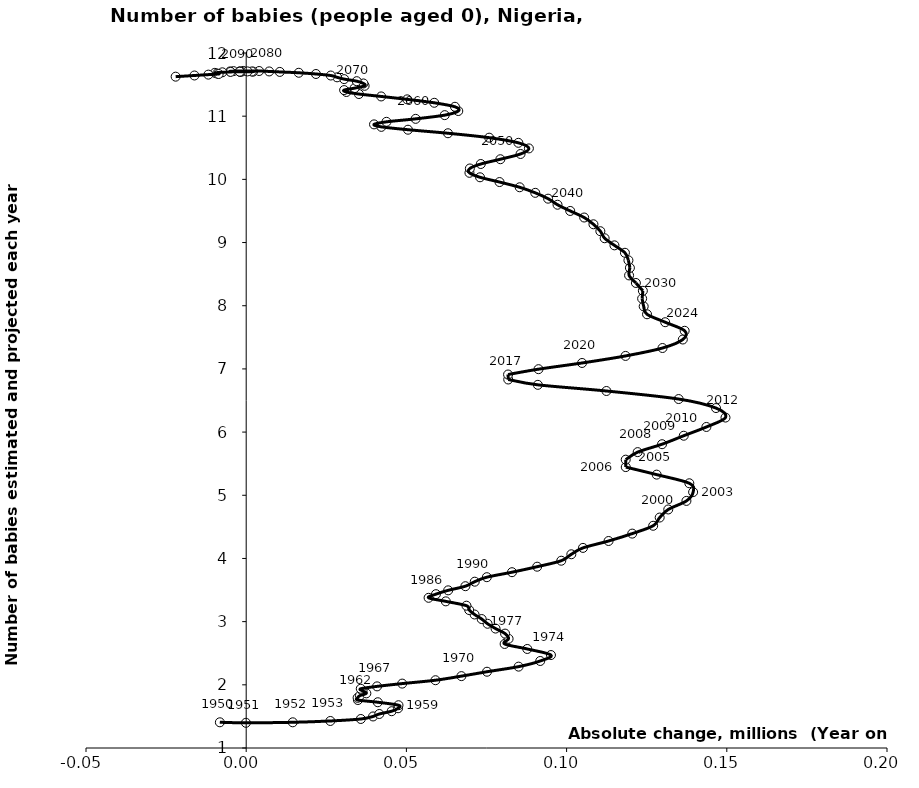
| Category | Series 0 |
|---|---|
| -0.008219999999999894 | 1.407 |
| -8.649999999998936e-05 | 1.399 |
| 0.014528499999999944 | 1.407 |
| 0.026262000000000008 | 1.428 |
| 0.03577600000000003 | 1.459 |
| 0.03959500000000005 | 1.499 |
| 0.04154150000000001 | 1.538 |
| 0.04540349999999993 | 1.582 |
| 0.04740599999999995 | 1.629 |
| 0.04753050000000003 | 1.677 |
| 0.041073000000000026 | 1.724 |
| 0.03486250000000002 | 1.759 |
| 0.03476950000000001 | 1.794 |
| 0.03549899999999995 | 1.829 |
| 0.03749899999999995 | 1.865 |
| 0.036323000000000105 | 1.904 |
| 0.03575700000000004 | 1.938 |
| 0.04084449999999995 | 1.975 |
| 0.04869000000000001 | 2.019 |
| 0.05907499999999999 | 2.073 |
| 0.06717050000000002 | 2.138 |
| 0.07515899999999998 | 2.207 |
| 0.08501650000000005 | 2.288 |
| 0.09177349999999995 | 2.377 |
| 0.09511599999999998 | 2.471 |
| 0.08772250000000015 | 2.567 |
| 0.08065800000000012 | 2.647 |
| 0.0818954999999999 | 2.729 |
| 0.08079399999999981 | 2.811 |
| 0.07782650000000002 | 2.89 |
| 0.07533950000000011 | 2.966 |
| 0.07349899999999998 | 3.041 |
| 0.07126949999999987 | 3.113 |
| 0.06959650000000006 | 3.183 |
| 0.06873850000000004 | 3.252 |
| 0.06230250000000015 | 3.321 |
| 0.0569265000000001 | 3.377 |
| 0.0592269999999997 | 3.435 |
| 0.06303749999999986 | 3.496 |
| 0.06841200000000014 | 3.561 |
| 0.07133200000000017 | 3.632 |
| 0.07510249999999985 | 3.704 |
| 0.08296149999999991 | 3.783 |
| 0.09081400000000017 | 3.869 |
| 0.09833700000000012 | 3.964 |
| 0.10147949999999972 | 4.066 |
| 0.10510799999999998 | 4.167 |
| 0.1131000000000002 | 4.276 |
| 0.12048049999999977 | 4.393 |
| 0.12701850000000015 | 4.517 |
| 0.1290530000000003 | 4.647 |
| 0.13172899999999954 | 4.775 |
| 0.13739899999999983 | 4.911 |
| 0.1394865000000003 | 5.05 |
| 0.1383040000000002 | 5.19 |
| 0.12810999999999995 | 5.327 |
| 0.11846899999999971 | 5.446 |
| 0.11845600000000012 | 5.564 |
| 0.12218000000000018 | 5.683 |
| 0.12979550000000017 | 5.808 |
| 0.13656099999999993 | 5.943 |
| 0.1436305 | 6.081 |
| 0.1495915000000001 | 6.23 |
| 0.14662699999999962 | 6.38 |
| 0.1349714999999998 | 6.523 |
| 0.11243099999999995 | 6.65 |
| 0.09102600000000027 | 6.748 |
| 0.08178300000000016 | 6.832 |
| 0.08172999999999986 | 6.911 |
| 0.09123400000000004 | 6.996 |
| 0.10482600000000009 | 7.094 |
| 0.1183955000000001 | 7.206 |
| 0.12993100000000002 | 7.331 |
| 0.13627150000000032 | 7.465 |
| 0.1368475 | 7.603 |
| 0.13076799999999977 | 7.739 |
| 0.12510399999999944 | 7.865 |
| 0.1240584999999994 | 7.989 |
| 0.12357350000000089 | 8.113 |
| 0.1238020000000013 | 8.236 |
| 0.12162199999999945 | 8.361 |
| 0.11950099999999875 | 8.48 |
| 0.11976000000000031 | 8.6 |
| 0.11929550000000066 | 8.719 |
| 0.11820649999999944 | 8.838 |
| 0.11493100000000034 | 8.956 |
| 0.11187500000000039 | 9.068 |
| 0.11053299999999933 | 9.179 |
| 0.10837650000000032 | 9.289 |
| 0.1054820000000003 | 9.396 |
| 0.1011280000000001 | 9.5 |
| 0.09716699999999978 | 9.598 |
| 0.09422499999999889 | 9.694 |
| 0.09022050000000004 | 9.787 |
| 0.0853565000000005 | 9.875 |
| 0.07906550000000045 | 9.958 |
| 0.07298000000000027 | 10.033 |
| 0.06967849999999931 | 10.104 |
| 0.06981349999999953 | 10.172 |
| 0.07321750000000016 | 10.243 |
| 0.07932700000000104 | 10.319 |
| 0.08562700000000056 | 10.402 |
| 0.08823149999999913 | 10.49 |
| 0.08494949999999957 | 10.578 |
| 0.07583100000000087 | 10.66 |
| 0.06297099999999922 | 10.73 |
| 0.050495999999999874 | 10.786 |
| 0.042181000000001134 | 10.831 |
| 0.03989899999999924 | 10.87 |
| 0.043775499999999745 | 10.911 |
| 0.05288299999999957 | 10.958 |
| 0.061958999999999875 | 11.016 |
| 0.06619050000000115 | 11.082 |
| 0.06515199999999943 | 11.149 |
| 0.05869649999999993 | 11.212 |
| 0.05025150000000078 | 11.266 |
| 0.04211999999999971 | 11.312 |
| 0.035175999999999874 | 11.351 |
| 0.031268500000000365 | 11.383 |
| 0.03056349999999952 | 11.413 |
| 0.03383950000000002 | 11.444 |
| 0.036961500000000314 | 11.481 |
| 0.03659549999999889 | 11.518 |
| 0.034500500000000045 | 11.554 |
| 0.03056950000000036 | 11.587 |
| 0.02836449999999946 | 11.615 |
| 0.02639849999999999 | 11.644 |
| 0.021772499999999972 | 11.668 |
| 0.0164080000000002 | 11.687 |
| 0.010479500000000641 | 11.701 |
| 0.007170000000000343 | 11.708 |
| 0.004036000000000151 | 11.715 |
| -0.000924000000000369 | 11.716 |
| -0.003953000000000095 | 11.713 |
| -0.005025999999999975 | 11.708 |
| -0.0015005000000005708 | 11.703 |
| 0.0021449999999996194 | 11.705 |
| 0.0017695000000008676 | 11.707 |
| 0.0004130000000008849 | 11.709 |
| -0.0020430000000013493 | 11.708 |
| -0.001992500000000952 | 11.705 |
| -0.001993999999998941 | 11.704 |
| -0.0048794999999994815 | 11.701 |
| -0.007442000000000171 | 11.694 |
| -0.009787000000000212 | 11.686 |
| -0.009077999999999697 | 11.675 |
| -0.00859750000000048 | 11.668 |
| -0.01181249999999956 | 11.658 |
| -0.0161554999999991 | 11.644 |
| -0.022019500000000747 | 11.625 |